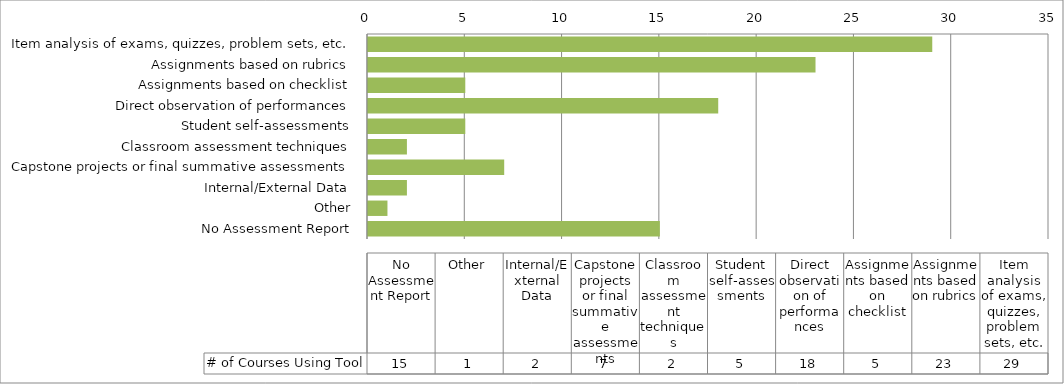
| Category | # of Courses Using Tool |
|---|---|
| Item analysis of exams, quizzes, problem sets, etc. | 29 |
| Assignments based on rubrics | 23 |
| Assignments based on checklist | 5 |
| Direct observation of performances | 18 |
| Student self-assessments | 5 |
| Classroom assessment techniques | 2 |
| Capstone projects or final summative assessments | 7 |
| Internal/External Data | 2 |
| Other | 1 |
| No Assessment Report | 15 |